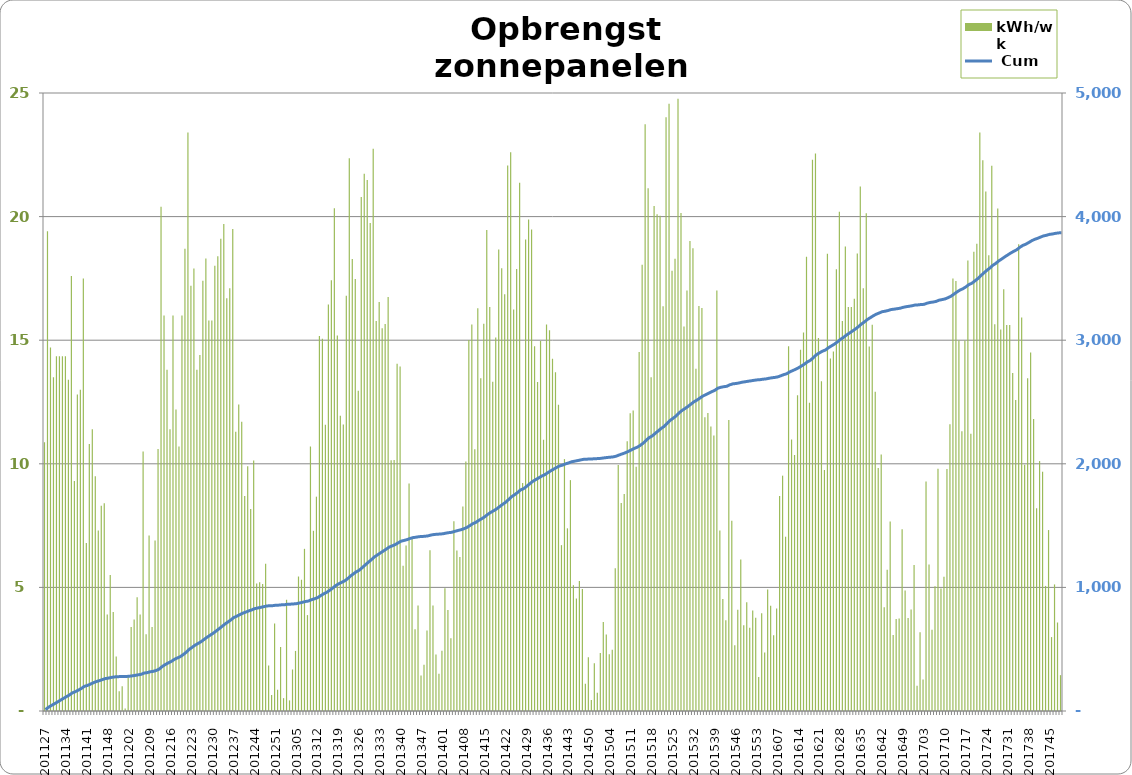
| Category |  kWh/wk |
|---|---|
| 201127.0 | 10.87 |
| 201128.0 | 19.41 |
| 201129.0 | 14.7 |
| 201130.0 | 13.502 |
| 201131.0 | 14.354 |
| 201132.0 | 14.354 |
| 201133.0 | 14.354 |
| 201134.0 | 14.354 |
| 201135.0 | 13.402 |
| 201136.0 | 17.6 |
| 201137.0 | 9.3 |
| 201138.0 | 12.8 |
| 201139.0 | 13 |
| 201140.0 | 17.5 |
| 201141.0 | 6.8 |
| 201142.0 | 10.8 |
| 201143.0 | 11.4 |
| 201144.0 | 9.5 |
| 201145.0 | 7.3 |
| 201146.0 | 8.3 |
| 201147.0 | 8.4 |
| 201148.0 | 3.9 |
| 201149.0 | 5.5 |
| 201150.0 | 4 |
| 201151.0 | 2.2 |
| 201152.0 | 0.8 |
| 201153.0 | 1 |
| 201201.0 | 0.1 |
| 201202.0 | 1.4 |
| 201203.0 | 3.4 |
| 201204.0 | 3.7 |
| 201205.0 | 4.6 |
| 201206.0 | 3.9 |
| 201207.0 | 10.5 |
| 201208.0 | 3.1 |
| 201209.0 | 7.1 |
| 201210.0 | 3.4 |
| 201211.0 | 6.9 |
| 201212.0 | 10.6 |
| 201213.0 | 20.4 |
| 201214.0 | 16 |
| 201215.0 | 13.8 |
| 201216.0 | 11.4 |
| 201217.0 | 16 |
| 201218.0 | 12.2 |
| 201219.0 | 10.7 |
| 201220.0 | 16 |
| 201221.0 | 18.7 |
| 201222.0 | 23.4 |
| 201223.0 | 17.2 |
| 201224.0 | 17.9 |
| 201225.0 | 13.8 |
| 201226.0 | 14.4 |
| 201227.0 | 17.4 |
| 201228.0 | 18.3 |
| 201229.0 | 15.8 |
| 201230.0 | 15.793 |
| 201231.0 | 18.013 |
| 201232.0 | 18.393 |
| 201233.0 | 19.1 |
| 201234.0 | 19.7 |
| 201235.0 | 16.7 |
| 201236.0 | 17.1 |
| 201237.0 | 19.5 |
| 201238.0 | 11.3 |
| 201239.0 | 12.4 |
| 201240.0 | 11.7 |
| 201241.0 | 8.7 |
| 201242.0 | 9.9 |
| 201243.0 | 8.17 |
| 201244.0 | 10.13 |
| 201245.0 | 5.16 |
| 201246.0 | 5.21 |
| 201247.0 | 5.14 |
| 201248.0 | 5.96 |
| 201249.0 | 1.84 |
| 201250.0 | 0.65 |
| 201251.0 | 3.54 |
| 201252.0 | 0.86 |
| 201253.0 | 2.59 |
| 201301.0 | 0.52 |
| 201302.0 | 4.5 |
| 201303.0 | 0.43 |
| 201304.0 | 1.68 |
| 201305.0 | 2.43 |
| 201306.0 | 5.44 |
| 201307.0 | 5.31 |
| 201308.0 | 6.56 |
| 201309.0 | 3.88 |
| 201310.0 | 10.7 |
| 201311.0 | 7.29 |
| 201312.0 | 8.67 |
| 201313.0 | 15.17 |
| 201314.0 | 15.06 |
| 201315.0 | 11.58 |
| 201316.0 | 16.44 |
| 201317.0 | 17.43 |
| 201318.0 | 20.34 |
| 201319.0 | 15.19 |
| 201320.0 | 11.94 |
| 201321.0 | 11.59 |
| 201322.0 | 16.8 |
| 201323.0 | 22.36 |
| 201324.0 | 18.28 |
| 201325.0 | 17.48 |
| 201326.0 | 12.96 |
| 201327.0 | 20.79 |
| 201328.0 | 21.73 |
| 201329.0 | 21.48 |
| 201330.0 | 19.74 |
| 201331.0 | 22.74 |
| 201332.0 | 15.78 |
| 201333.0 | 16.55 |
| 201334.0 | 15.48 |
| 201335.0 | 15.66 |
| 201336.0 | 16.75 |
| 201337.0 | 10.14 |
| 201338.0 | 10.15 |
| 201339.0 | 14.05 |
| 201340.0 | 13.94 |
| 201341.0 | 5.88 |
| 201342.0 | 6.69 |
| 201343.0 | 9.2 |
| 201344.0 | 7.02 |
| 201345.0 | 3.31 |
| 201346.0 | 4.27 |
| 201347.0 | 1.44 |
| 201348.0 | 1.87 |
| 201349.0 | 3.26 |
| 201350.0 | 6.5 |
| 201351.0 | 4.27 |
| 201352.0 | 2.29 |
| 201353.0 | 1.51 |
| 201401.0 | 2.44 |
| 201402.0 | 4.97 |
| 201403.0 | 4.09 |
| 201404.0 | 2.94 |
| 201405.0 | 7.68 |
| 201406.0 | 6.49 |
| 201407.0 | 6.234 |
| 201408.0 | 8.27 |
| 201409.0 | 10.09 |
| 201410.0 | 15.01 |
| 201411.0 | 15.64 |
| 201412.0 | 10.59 |
| 201413.0 | 16.29 |
| 201414.0 | 13.46 |
| 201415.0 | 15.67 |
| 201416.0 | 19.46 |
| 201417.0 | 16.34 |
| 201418.0 | 13.32 |
| 201419.0 | 15.11 |
| 201420.0 | 18.67 |
| 201421.0 | 17.91 |
| 201422.0 | 16.86 |
| 201423.0 | 22.07 |
| 201424.0 | 22.6 |
| 201425.0 | 16.24 |
| 201426.0 | 17.88 |
| 201427.0 | 21.37 |
| 201428.0 | 9.22 |
| 201429.0 | 19.07 |
| 201430.0 | 19.88 |
| 201431.0 | 19.48 |
| 201432.0 | 14.76 |
| 201433.0 | 13.31 |
| 201434.0 | 14.97 |
| 201435.0 | 10.97 |
| 201436.0 | 15.64 |
| 201437.0 | 15.4 |
| 201438.0 | 14.25 |
| 201439.0 | 13.7 |
| 201440.0 | 12.39 |
| 201441.0 | 6.71 |
| 201442.0 | 10.19 |
| 201443.0 | 7.39 |
| 201444.0 | 9.34 |
| 201445.0 | 5.09 |
| 201446.0 | 4.55 |
| 201447.0 | 5.26 |
| 201448.0 | 4.94 |
| 201449.0 | 1.1 |
| 201450.0 | 2.17 |
| 201451.0 | 0.45 |
| 201452.0 | 1.93 |
| 201453.0 | 0.74 |
| 201501.0 | 2.35 |
| 201502.0 | 3.6 |
| 201503.0 | 3.09 |
| 201504.0 | 2.3 |
| 201505.0 | 2.48 |
| 201506.0 | 5.77 |
| 201507.0 | 9.95 |
| 201508.0 | 8.41 |
| 201509.0 | 8.78 |
| 201510.0 | 10.91 |
| 201511.0 | 12.04 |
| 201512.0 | 12.16 |
| 201513.0 | 9.88 |
| 201514.0 | 14.52 |
| 201515.0 | 18.05 |
| 201516.0 | 23.74 |
| 201517.0 | 21.15 |
| 201518.0 | 13.5 |
| 201519.0 | 20.43 |
| 201520.0 | 20.1 |
| 201521.0 | 20.03 |
| 201522.0 | 16.37 |
| 201523.0 | 24.02 |
| 201524.0 | 24.57 |
| 201525.0 | 17.81 |
| 201526.0 | 18.29 |
| 201527.0 | 24.77 |
| 201528.0 | 20.15 |
| 201529.0 | 15.55 |
| 201530.0 | 17.01 |
| 201531.0 | 19.01 |
| 201532.0 | 18.72 |
| 201533.0 | 13.85 |
| 201534.0 | 16.38 |
| 201535.0 | 16.3 |
| 201536.0 | 11.88 |
| 201537.0 | 12.06 |
| 201538.0 | 11.51 |
| 201539.0 | 11.14 |
| 201540.0 | 17.008 |
| 201541.0 | 7.3 |
| 201542.0 | 4.53 |
| 201543.0 | 3.67 |
| 201544.0 | 11.77 |
| 201545.0 | 7.7 |
| 201546.0 | 2.66 |
| 201547.0 | 4.1 |
| 201548.0 | 6.13 |
| 201549.0 | 3.47 |
| 201550.0 | 4.4 |
| 201551.0 | 3.37 |
| 201552.0 | 4.07 |
| 201553.0 | 3.77 |
| 201601.0 | 1.38 |
| 201602.0 | 3.95 |
| 201603.0 | 2.37 |
| 201604.0 | 4.91 |
| 201605.0 | 4.26 |
| 201606.0 | 3.06 |
| 201607.0 | 4.15 |
| 201608.0 | 8.7 |
| 201609.0 | 9.52 |
| 201610.0 | 7.05 |
| 201611.0 | 14.76 |
| 201612.0 | 10.98 |
| 201613.0 | 10.36 |
| 201614.0 | 12.77 |
| 201615.0 | 14.61 |
| 201616.0 | 15.31 |
| 201617.0 | 18.38 |
| 201618.0 | 12.47 |
| 201619.0 | 22.3 |
| 201620.0 | 22.55 |
| 201621.0 | 15.09 |
| 201622.0 | 13.34 |
| 201623.0 | 9.75 |
| 201624.0 | 18.5 |
| 201625.0 | 14.26 |
| 201626.0 | 14.54 |
| 201627.0 | 17.87 |
| 201628.0 | 20.2 |
| 201629.0 | 15.78 |
| 201630.0 | 18.79 |
| 201631.0 | 16.338 |
| 201632.0 | 16.338 |
| 201633.0 | 16.672 |
| 201634.0 | 18.51 |
| 201635.0 | 21.22 |
| 201636.0 | 17.1 |
| 201637.0 | 20.14 |
| 201638.0 | 14.75 |
| 201639.0 | 15.62 |
| 201640.0 | 12.91 |
| 201641.0 | 9.83 |
| 201642.0 | 10.38 |
| 201643.0 | 4.2 |
| 201644.0 | 5.71 |
| 201645.0 | 7.67 |
| 201646.0 | 3.07 |
| 201647.0 | 3.72 |
| 201648.0 | 3.74 |
| 201649.0 | 7.35 |
| 201650.0 | 4.87 |
| 201651.0 | 3.76 |
| 201652.0 | 4.11 |
| 201653.0 | 5.91 |
| 201701.0 | 1.02 |
| 201702.0 | 3.19 |
| 201703.0 | 1.27 |
| 201704.0 | 9.28 |
| 201705.0 | 5.93 |
| 201706.0 | 3.29 |
| 201707.0 | 5.05 |
| 201708.0 | 9.8 |
| 201709.0 | 4.96 |
| 201710.0 | 5.43 |
| 201711.0 | 9.79 |
| 201712.0 | 11.6 |
| 201713.0 | 17.5 |
| 201714.0 | 17.39 |
| 201715.0 | 14.99 |
| 201716.0 | 11.32 |
| 201717.0 | 14.99 |
| 201718.0 | 18.22 |
| 201719.0 | 11.22 |
| 201720.0 | 18.58 |
| 201721.0 | 18.9 |
| 201722.0 | 23.4 |
| 201723.0 | 22.28 |
| 201724.0 | 21.02 |
| 201725.0 | 18.44 |
| 201726.0 | 22.06 |
| 201727.0 | 15.65 |
| 201728.0 | 20.33 |
| 201729.0 | 15.43 |
| 201730.0 | 17.064 |
| 201731.0 | 15.617 |
| 201732.0 | 15.617 |
| 201733.0 | 13.674 |
| 201734.0 | 12.58 |
| 201735.0 | 18.88 |
| 201736.0 | 15.92 |
| 201737.0 | 9.96 |
| 201738.0 | 13.46 |
| 201739.0 | 14.5 |
| 201740.0 | 11.81 |
| 201741.0 | 8.2 |
| 201742.0 | 10.11 |
| 201743.0 | 9.68 |
| 201744.0 | 5.06 |
| 201745.0 | 7.32 |
| 201746.0 | 2.99 |
| 201747.0 | 5.12 |
| 201748.0 | 3.58 |
| 201749.0 | 1.45 |